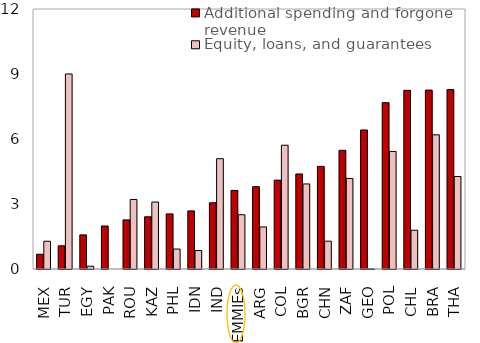
| Category | Additional spending and forgone revenue | Equity, loans, and guarantees |
|---|---|---|
| MEX | 0.681 | 1.281 |
| TUR | 1.071 | 9.002 |
| EGY | 1.574 | 0.128 |
| PAK | 1.984 | 0 |
| ROU | 2.266 | 3.209 |
| KAZ | 2.41 | 3.09 |
| PHL | 2.543 | 0.921 |
| IDN | 2.68 | 0.853 |
| IND | 3.057 | 5.091 |
| EMMIEs | 3.627 | 2.504 |
| ARG | 3.799 | 1.941 |
| COL | 4.1 | 5.713 |
| BGR | 4.386 | 3.926 |
| CHN | 4.735 | 1.284 |
| ZAF | 5.477 | 4.18 |
| GEO | 6.417 | 0 |
| POL | 7.677 | 5.424 |
| CHL | 8.245 | 1.79 |
| BRA | 8.257 | 6.193 |
| THA | 8.279 | 4.268 |